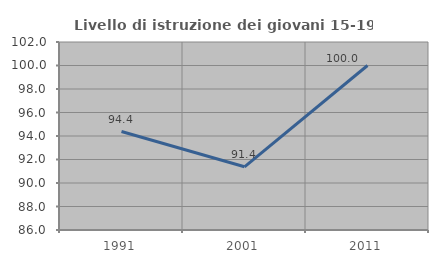
| Category | Livello di istruzione dei giovani 15-19 anni |
|---|---|
| 1991.0 | 94.382 |
| 2001.0 | 91.379 |
| 2011.0 | 100 |